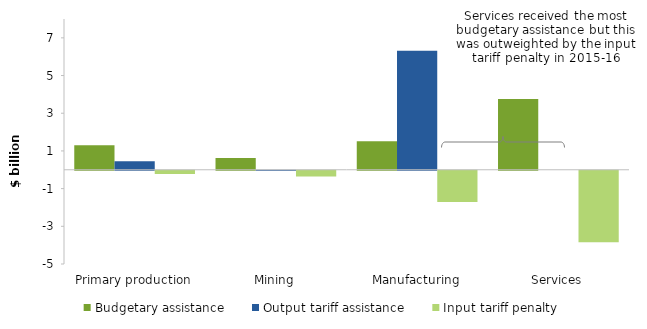
| Category | Budgetary assistance | Output tariff assistance | Input tariff penalty |
|---|---|---|---|
| Primary production | 1.302 | 0.45 | -0.173 |
| Mining | 0.624 | 0.002 | -0.307 |
| Manufacturing | 1.515 | 6.312 | -1.651 |
| Services | 3.759 | 0 | -3.793 |